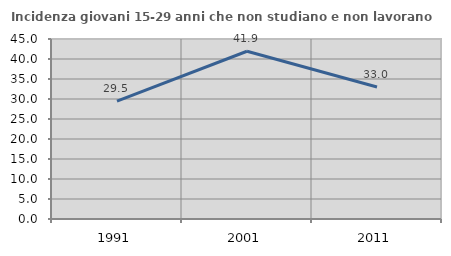
| Category | Incidenza giovani 15-29 anni che non studiano e non lavorano  |
|---|---|
| 1991.0 | 29.48 |
| 2001.0 | 41.943 |
| 2011.0 | 33.016 |